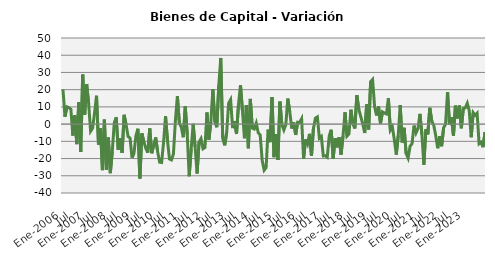
| Category | Series 0 |
|---|---|
| Ene-2006 | 20.075 |
|  | 4.303 |
|  | 10.038 |
|  | 9.526 |
|  | 8.666 |
|  | -6.672 |
| Jul | 5.109 |
|  | -11.617 |
|  | 12.627 |
|  | -16.161 |
|  | 28.758 |
|  | 5.563 |
| Ene-2007 | 23.277 |
|  | 12.204 |
|  | -4.134 |
|  | -2.401 |
|  | 6.348 |
|  | 16.463 |
| Jul | -11.849 |
|  | -2.36 |
|  | -26.749 |
|  | 2.597 |
|  | -26.415 |
|  | -7.782 |
| Ene-2008 | -28.505 |
|  | -15.791 |
|  | 0.746 |
|  | 3.948 |
|  | -14.926 |
|  | -8.307 |
| Jul | -16.669 |
|  | 5.39 |
|  | -0.326 |
|  | -7.174 |
|  | -8.077 |
|  | -19.468 |
| Ene-2009 | -16.87 |
|  | -6.709 |
|  | -2.71 |
|  | -31.579 |
|  | -5.411 |
|  | -10.129 |
| Jul | -14.055 |
|  | -16.613 |
|  | -2.538 |
|  | -16.898 |
|  | -12.336 |
|  | -7.739 |
| Ene-2010 | -16.038 |
|  | -22.108 |
|  | -22.297 |
|  | -10.772 |
|  | 4.648 |
|  | -9.689 |
| Jul | -20.261 |
|  | -20.831 |
|  | -17.352 |
|  | 1.955 |
|  | 16.296 |
|  | 0.597 |
| Ene-2011 | -1.892 |
|  | -7.625 |
|  | 10.243 |
|  | -6.095 |
|  | -30.265 |
|  | -14.556 |
| Jul | 0.183 |
|  | -13.2 |
|  | -28.674 |
|  | -10.406 |
|  | -8.4 |
|  | -14.305 |
| Ene-2012 | -13.543 |
|  | 6.755 |
|  | -9.016 |
|  | 1.439 |
|  | 20.395 |
|  | 1.41 |
| Jul | -1.796 |
|  | 22.397 |
|  | 38.423 |
|  | -8.224 |
|  | -12.304 |
|  | -4.951 |
| Ene-2013 | 12.189 |
|  | 14.247 |
|  | -2.306 |
|  | 1.767 |
|  | -5.728 |
|  | 11.438 |
| Jul | 22.657 |
|  | 7.761 |
|  | -8.209 |
|  | 11.087 |
|  | -14.036 |
|  | 14.622 |
| Ene-2014 | -2.329 |
|  | -2.844 |
|  | 0.578 |
|  | -5.019 |
|  | -6.36 |
|  | -20.999 |
| Jul | -26.779 |
|  | -25.279 |
|  | -3.225 |
|  | -10.488 |
|  | 15.754 |
|  | -19.196 |
| Ene-2015 | -5.829 |
|  | -20.831 |
|  | 13.056 |
|  | -0.382 |
|  | -3.439 |
|  | -0.283 |
| Jul | 14.794 |
|  | 7.11 |
|  | -2.573 |
|  | 1.019 |
|  | -6.299 |
|  | 1.119 |
| Ene-2016 | 0.956 |
|  | 3.099 |
|  | -20.121 |
|  | -8.935 |
|  | -11.538 |
|  | -5.659 |
| Jul | -18.434 |
|  | -2.492 |
|  | 3.468 |
|  | 4.178 |
|  | -8.156 |
|  | -7.155 |
| Ene-2017 | -18.512 |
|  | -18.362 |
|  | -19.224 |
|  | -6.888 |
|  | -3.3 |
|  | -20.111 |
| Jul | -8.231 |
|  | -13.468 |
|  | -7.632 |
|  | -17.676 |
|  | -6.889 |
|  | 6.873 |
| Ene-2018 | -7.001 |
|  | -5.682 |
|  | 8.364 |
|  | 0.121 |
|  | -2.541 |
|  | 16.764 |
| Jul | 8.641 |
|  | 4.393 |
|  | 0.101 |
|  | -5.192 |
|  | 11.439 |
|  | -3.064 |
| Ene-2019 | 24.681 |
|  | 25.909 |
|  | 10.219 |
|  | 5.034 |
|  | 10.222 |
|  | 0.4 |
| Jul | 7.108 |
|  | 6.428 |
|  | 5.898 |
|  | 14.99 |
|  | -3.479 |
|  | -1.595 |
| Ene-2020 | -8.901 |
|  | -17.712 |
|  | -6.633 |
|  | 11.024 |
|  | -10.645 |
|  | -2.137 |
| Jul | -17.066 |
|  | -19.732 |
|  | -12.822 |
|  | -11.308 |
|  | -0.872 |
|  | -5.126 |
| Ene-2021 | -2.578 |
|  | 5.938 |
|  | -5.936 |
|  | -23.611 |
|  | -2.96 |
|  | -5.961 |
| Jul | 9.472 |
|  | 1.735 |
|  | -0.645 |
|  | -6.593 |
|  | -14 |
|  | -6.955 |
| Ene-2022 | -12.841 |
|  | -2.101 |
|  | 0.051 |
|  | 18.645 |
|  | -0.48 |
|  | 4.041 |
| Jul | -6.788 |
|  | 10.682 |
|  | 3.319 |
|  | 10.786 |
|  | -2.409 |
|  | 9.039 |
| Ene-2023 | 9.42 |